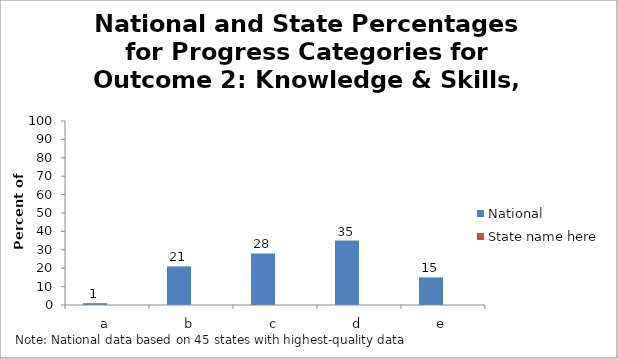
| Category | National | State name here |
|---|---|---|
| a | 1 |  |
| b | 21 |  |
| c | 28 |  |
| d | 35 |  |
| e | 15 |  |